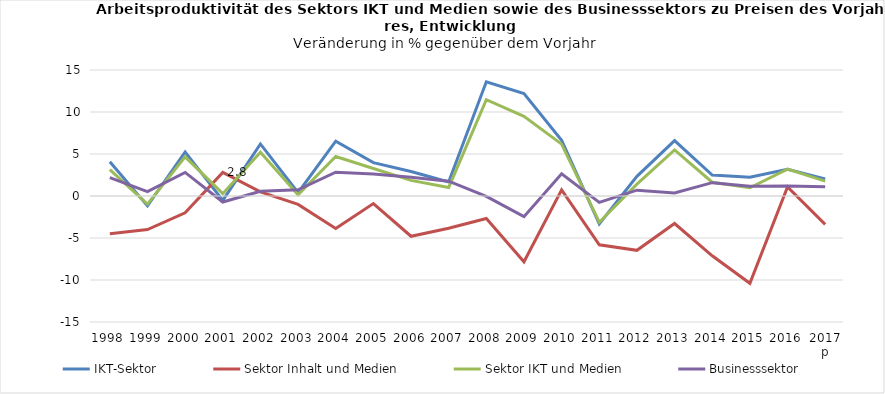
| Category | IKT-Sektor | Sektor Inhalt und Medien | Sektor IKT und Medien | Businesssektor |
|---|---|---|---|---|
| 1998 | 4.07 | -4.485 | 3.135 | 2.197 |
| 1999 | -1.175 | -3.991 | -0.964 | 0.52 |
| 2000 | 5.248 | -2.001 | 4.66 | 2.808 |
| 2001 | -0.523 | 2.808 | 0.28 | -0.72 |
| 2002 | 6.196 | 0.49 | 5.213 | 0.563 |
| 2003 | 0.395 | -1.003 | 0.146 | 0.745 |
| 2004 | 6.521 | -3.856 | 4.698 | 2.836 |
| 2005 | 3.976 | -0.904 | 3.279 | 2.607 |
| 2006 | 2.91 | -4.793 | 1.857 | 2.232 |
| 2007 | 1.675 | -3.84 | 1.016 | 1.758 |
| 2008 | 13.603 | -2.672 | 11.468 | -0.038 |
| 2009 | 12.192 | -7.829 | 9.482 | -2.463 |
| 2010 | 6.641 | 0.728 | 6.173 | 2.643 |
| 2011 | -3.328 | -5.811 | -3.118 | -0.759 |
| 2012 | 2.343 | -6.47 | 1.413 | 0.691 |
| 2013 | 6.592 | -3.273 | 5.49 | 0.37 |
| 2014 | 2.487 | -7.118 | 1.638 | 1.587 |
| 2015 | 2.223 | -10.394 | 0.984 | 1.163 |
| 2016 | 3.191 | 1.09 | 3.203 | 1.201 |
| 2017 p | 2.037 | -3.378 | 1.765 | 1.111 |